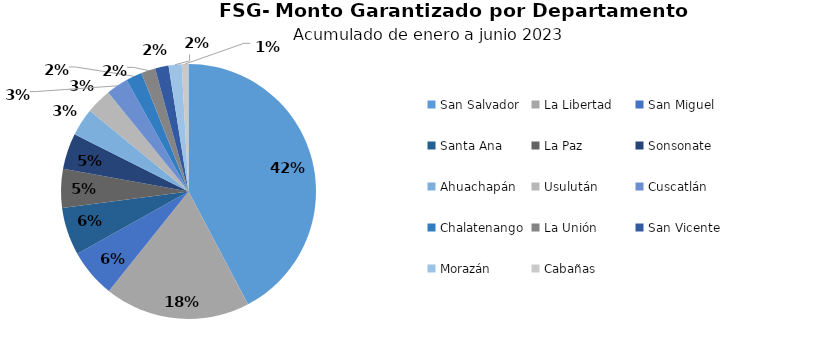
| Category | Monto |
|---|---|
| San Salvador | 13.487 |
| La Libertad | 5.892 |
| San Miguel | 1.956 |
| Santa Ana | 1.931 |
| La Paz | 1.573 |
| Sonsonate | 1.46 |
| Ahuachapán | 1.116 |
| Usulután | 1.031 |
| Cuscatlán | 0.886 |
| Chalatenango | 0.656 |
| La Unión | 0.571 |
| San Vicente | 0.545 |
| Morazán | 0.528 |
| Cabañas | 0.273 |